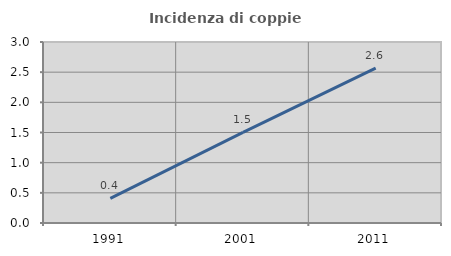
| Category | Incidenza di coppie miste |
|---|---|
| 1991.0 | 0.408 |
| 2001.0 | 1.502 |
| 2011.0 | 2.567 |